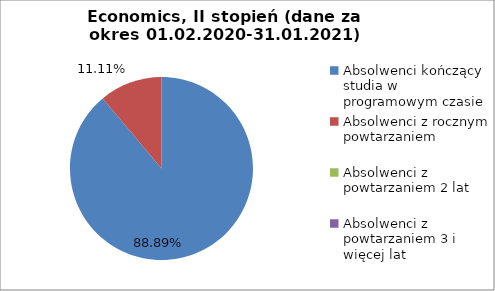
| Category | Series 0 |
|---|---|
| Absolwenci kończący studia w programowym czasie | 88.889 |
| Absolwenci z rocznym powtarzaniem | 11.111 |
| Absolwenci z powtarzaniem 2 lat | 0 |
| Absolwenci z powtarzaniem 3 i więcej lat | 0 |